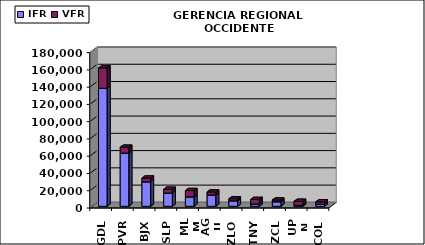
| Category | IFR | VFR |
|---|---|---|
| GDL | 136767 | 23511 |
| PVR | 61653 | 6802 |
| BJX | 28369 | 4330 |
| SLP | 15323 | 4424 |
| MLM | 10923 | 7326 |
| AGU | 13135 | 3488 |
| ZLO | 6373 | 2400 |
| TNY | 2610 | 5318 |
| ZCL | 5258 | 2030 |
| UPN | 1231 | 4566 |
| COL | 2496 | 2728 |